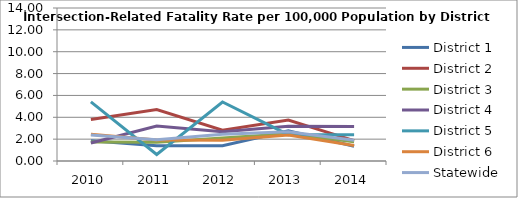
| Category | District 1 | District 2 | District 3 | District 4 | District 5 | District 6 | Statewide |
|---|---|---|---|---|---|---|---|
| 2010.0 | 1.859 | 3.795 | 1.75 | 1.645 | 5.404 | 2.445 | 2.372 |
| 2011.0 | 1.398 | 4.707 | 1.713 | 3.208 | 0.598 | 1.911 | 1.956 |
| 2012.0 | 1.392 | 2.817 | 2.112 | 2.671 | 5.397 | 1.909 | 2.444 |
| 2013.0 | 2.758 | 3.753 | 2.492 | 3.177 | 2.408 | 2.375 | 2.667 |
| 2014.0 | 1.355 | 1.869 | 1.764 | 3.15 | 2.406 | 1.413 | 1.897 |